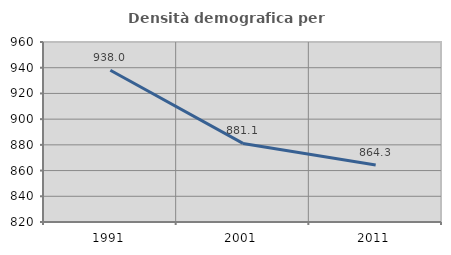
| Category | Densità demografica |
|---|---|
| 1991.0 | 938.024 |
| 2001.0 | 881.114 |
| 2011.0 | 864.292 |